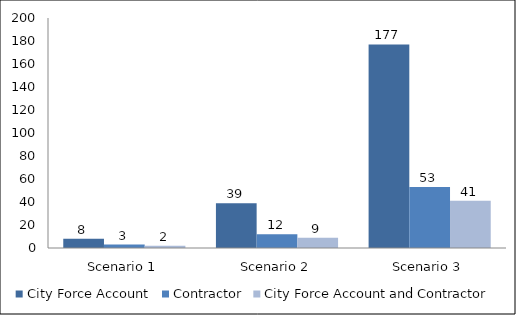
| Category | City Force Account | Contractor | City Force Account and Contractor |
|---|---|---|---|
| Scenario 1 | 8 | 3 | 2 |
| Scenario 2 | 39 | 12 | 9 |
| Scenario 3 | 177 | 53 | 41 |